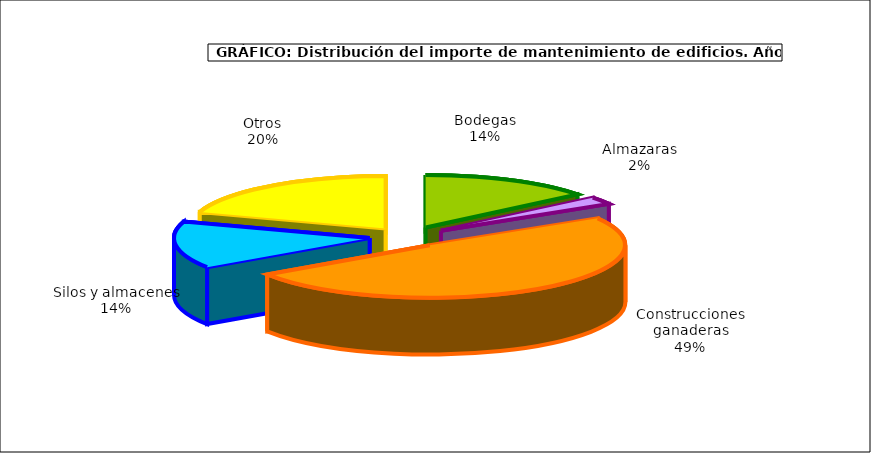
| Category | Series 0 |
|---|---|
| 0 | 75.176 |
| 1 | 12.164 |
| 2 | 261.758 |
| 3 | 76.92 |
| 4 | 106.064 |